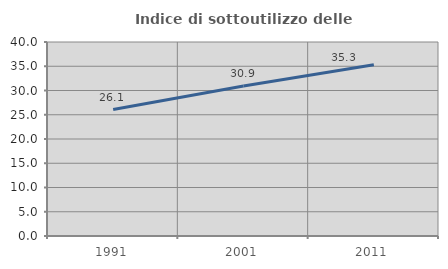
| Category | Indice di sottoutilizzo delle abitazioni  |
|---|---|
| 1991.0 | 26.071 |
| 2001.0 | 30.928 |
| 2011.0 | 35.316 |